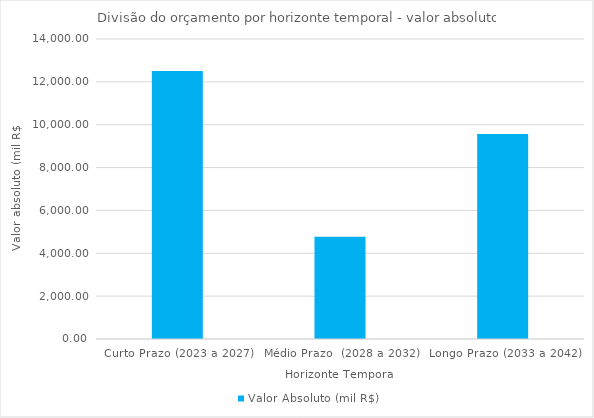
| Category | Valor Absoluto (mil R$) |
|---|---|
| Curto Prazo (2023 a 2027) | 12512.272 |
| Médio Prazo  (2028 a 2032) | 4776.792 |
| Longo Prazo (2033 a 2042) | 9570.818 |